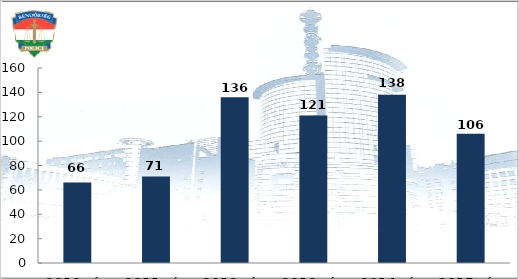
| Category | Biztonsági intézkedések száma |
|---|---|
| 2010. év | 66 |
| 2011. év | 71 |
| 2012. év | 136 |
| 2013. év | 121 |
| 2014. év | 138 |
| 2015. év | 106 |